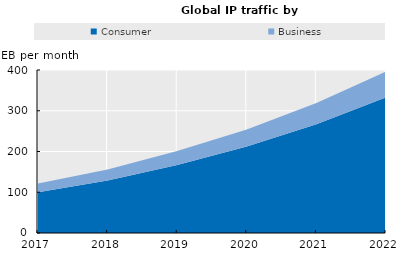
| Category | Consumer | Business |
|---|---|---|
| 2017.0 | 99.777 | 22 |
| 2018.0 | 129 | 27 |
| 2019.0 | 167 | 34 |
| 2020.0 | 212 | 42 |
| 2021.0 | 267 | 52 |
| 2022.0 | 333 | 63 |